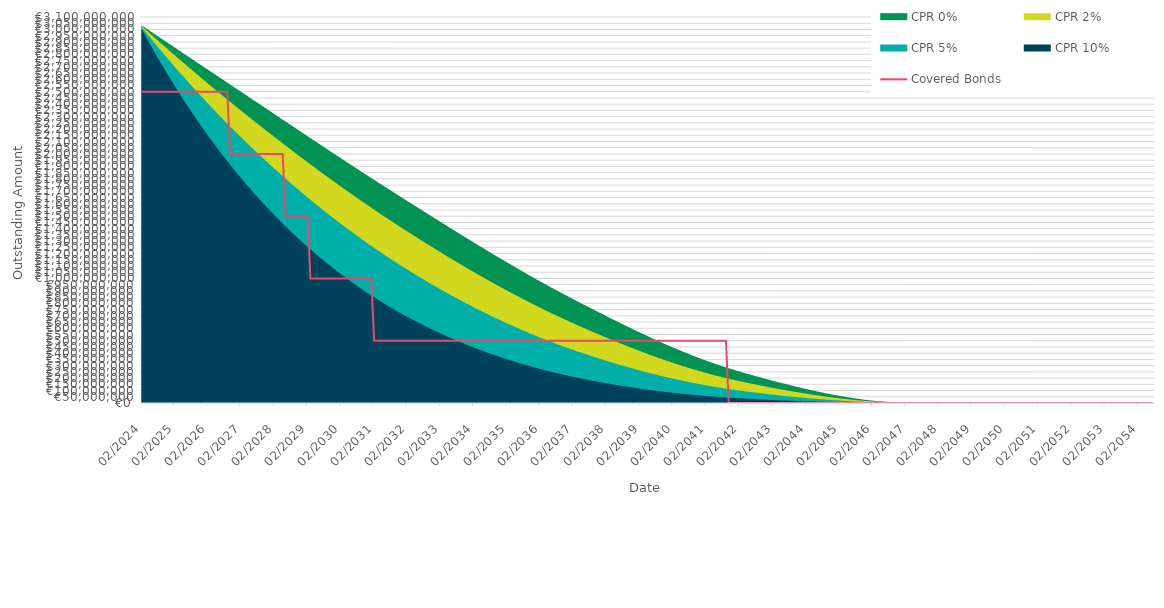
| Category | Covered Bonds |
|---|---|
| 2024-02-29 | 2500000000 |
| 2024-03-31 | 2500000000 |
| 2024-04-30 | 2500000000 |
| 2024-05-31 | 2500000000 |
| 2024-06-30 | 2500000000 |
| 2024-07-31 | 2500000000 |
| 2024-08-31 | 2500000000 |
| 2024-09-30 | 2500000000 |
| 2024-10-31 | 2500000000 |
| 2024-11-30 | 2500000000 |
| 2024-12-31 | 2500000000 |
| 2025-01-31 | 2500000000 |
| 2025-02-28 | 2500000000 |
| 2025-03-31 | 2500000000 |
| 2025-04-30 | 2500000000 |
| 2025-05-31 | 2500000000 |
| 2025-06-30 | 2500000000 |
| 2025-07-31 | 2500000000 |
| 2025-08-31 | 2500000000 |
| 2025-09-30 | 2500000000 |
| 2025-10-31 | 2500000000 |
| 2025-11-30 | 2500000000 |
| 2025-12-31 | 2500000000 |
| 2026-01-31 | 2500000000 |
| 2026-02-28 | 2500000000 |
| 2026-03-31 | 2500000000 |
| 2026-04-30 | 2500000000 |
| 2026-05-31 | 2500000000 |
| 2026-06-30 | 2500000000 |
| 2026-07-31 | 2500000000 |
| 2026-08-31 | 2500000000 |
| 2026-09-30 | 2500000000 |
| 2026-10-31 | 2000000000 |
| 2026-11-30 | 2000000000 |
| 2026-12-31 | 2000000000 |
| 2027-01-31 | 2000000000 |
| 2027-02-28 | 2000000000 |
| 2027-03-31 | 2000000000 |
| 2027-04-30 | 2000000000 |
| 2027-05-31 | 2000000000 |
| 2027-06-30 | 2000000000 |
| 2027-07-31 | 2000000000 |
| 2027-08-31 | 2000000000 |
| 2027-09-30 | 2000000000 |
| 2027-10-31 | 2000000000 |
| 2027-11-30 | 2000000000 |
| 2027-12-31 | 2000000000 |
| 2028-01-31 | 2000000000 |
| 2028-02-29 | 2000000000 |
| 2028-03-31 | 2000000000 |
| 2028-04-30 | 2000000000 |
| 2028-05-31 | 2000000000 |
| 2028-06-30 | 1500000000 |
| 2028-07-31 | 1500000000 |
| 2028-08-31 | 1500000000 |
| 2028-09-30 | 1500000000 |
| 2028-10-31 | 1500000000 |
| 2028-11-30 | 1500000000 |
| 2028-12-31 | 1500000000 |
| 2029-01-31 | 1500000000 |
| 2029-02-28 | 1500000000 |
| 2029-03-31 | 1000000000 |
| 2029-04-30 | 1000000000 |
| 2029-05-31 | 1000000000 |
| 2029-06-30 | 1000000000 |
| 2029-07-31 | 1000000000 |
| 2029-08-31 | 1000000000 |
| 2029-09-30 | 1000000000 |
| 2029-10-31 | 1000000000 |
| 2029-11-30 | 1000000000 |
| 2029-12-31 | 1000000000 |
| 2030-01-31 | 1000000000 |
| 2030-02-28 | 1000000000 |
| 2030-03-31 | 1000000000 |
| 2030-04-30 | 1000000000 |
| 2030-05-31 | 1000000000 |
| 2030-06-30 | 1000000000 |
| 2030-07-31 | 1000000000 |
| 2030-08-31 | 1000000000 |
| 2030-09-30 | 1000000000 |
| 2030-10-31 | 1000000000 |
| 2030-11-30 | 1000000000 |
| 2030-12-31 | 1000000000 |
| 2031-01-31 | 1000000000 |
| 2031-02-28 | 500000000 |
| 2031-03-31 | 500000000 |
| 2031-04-30 | 500000000 |
| 2031-05-31 | 500000000 |
| 2031-06-30 | 500000000 |
| 2031-07-31 | 500000000 |
| 2031-08-31 | 500000000 |
| 2031-09-30 | 500000000 |
| 2031-10-31 | 500000000 |
| 2031-11-30 | 500000000 |
| 2031-12-31 | 500000000 |
| 2032-01-31 | 500000000 |
| 2032-02-29 | 500000000 |
| 2032-03-31 | 500000000 |
| 2032-04-30 | 500000000 |
| 2032-05-31 | 500000000 |
| 2032-06-30 | 500000000 |
| 2032-07-31 | 500000000 |
| 2032-08-31 | 500000000 |
| 2032-09-30 | 500000000 |
| 2032-10-31 | 500000000 |
| 2032-11-30 | 500000000 |
| 2032-12-31 | 500000000 |
| 2033-01-31 | 500000000 |
| 2033-02-28 | 500000000 |
| 2033-03-31 | 500000000 |
| 2033-04-30 | 500000000 |
| 2033-05-31 | 500000000 |
| 2033-06-30 | 500000000 |
| 2033-07-31 | 500000000 |
| 2033-08-31 | 500000000 |
| 2033-09-30 | 500000000 |
| 2033-10-31 | 500000000 |
| 2033-11-30 | 500000000 |
| 2033-12-31 | 500000000 |
| 2034-01-31 | 500000000 |
| 2034-02-28 | 500000000 |
| 2034-03-31 | 500000000 |
| 2034-04-30 | 500000000 |
| 2034-05-31 | 500000000 |
| 2034-06-30 | 500000000 |
| 2034-07-31 | 500000000 |
| 2034-08-31 | 500000000 |
| 2034-09-30 | 500000000 |
| 2034-10-31 | 500000000 |
| 2034-11-30 | 500000000 |
| 2034-12-31 | 500000000 |
| 2035-01-31 | 500000000 |
| 2035-02-28 | 500000000 |
| 2035-03-31 | 500000000 |
| 2035-04-30 | 500000000 |
| 2035-05-31 | 500000000 |
| 2035-06-30 | 500000000 |
| 2035-07-31 | 500000000 |
| 2035-08-31 | 500000000 |
| 2035-09-30 | 500000000 |
| 2035-10-31 | 500000000 |
| 2035-11-30 | 500000000 |
| 2035-12-31 | 500000000 |
| 2036-01-31 | 500000000 |
| 2036-02-29 | 500000000 |
| 2036-03-31 | 500000000 |
| 2036-04-30 | 500000000 |
| 2036-05-31 | 500000000 |
| 2036-06-30 | 500000000 |
| 2036-07-31 | 500000000 |
| 2036-08-31 | 500000000 |
| 2036-09-30 | 500000000 |
| 2036-10-31 | 500000000 |
| 2036-11-30 | 500000000 |
| 2036-12-31 | 500000000 |
| 2037-01-31 | 500000000 |
| 2037-02-28 | 500000000 |
| 2037-03-31 | 500000000 |
| 2037-04-30 | 500000000 |
| 2037-05-31 | 500000000 |
| 2037-06-30 | 500000000 |
| 2037-07-31 | 500000000 |
| 2037-08-31 | 500000000 |
| 2037-09-30 | 500000000 |
| 2037-10-31 | 500000000 |
| 2037-11-30 | 500000000 |
| 2037-12-31 | 500000000 |
| 2038-01-31 | 500000000 |
| 2038-02-28 | 500000000 |
| 2038-03-31 | 500000000 |
| 2038-04-30 | 500000000 |
| 2038-05-31 | 500000000 |
| 2038-06-30 | 500000000 |
| 2038-07-31 | 500000000 |
| 2038-08-31 | 500000000 |
| 2038-09-30 | 500000000 |
| 2038-10-31 | 500000000 |
| 2038-11-30 | 500000000 |
| 2038-12-31 | 500000000 |
| 2039-01-31 | 500000000 |
| 2039-02-28 | 500000000 |
| 2039-03-31 | 500000000 |
| 2039-04-30 | 500000000 |
| 2039-05-31 | 500000000 |
| 2039-06-30 | 500000000 |
| 2039-07-31 | 500000000 |
| 2039-08-31 | 500000000 |
| 2039-09-30 | 500000000 |
| 2039-10-31 | 500000000 |
| 2039-11-30 | 500000000 |
| 2039-12-31 | 500000000 |
| 2040-01-31 | 500000000 |
| 2040-02-29 | 500000000 |
| 2040-03-31 | 500000000 |
| 2040-04-30 | 500000000 |
| 2040-05-31 | 500000000 |
| 2040-06-30 | 500000000 |
| 2040-07-31 | 500000000 |
| 2040-08-31 | 500000000 |
| 2040-09-30 | 500000000 |
| 2040-10-31 | 500000000 |
| 2040-11-30 | 500000000 |
| 2040-12-31 | 500000000 |
| 2041-01-31 | 500000000 |
| 2041-02-28 | 500000000 |
| 2041-03-31 | 500000000 |
| 2041-04-30 | 500000000 |
| 2041-05-31 | 500000000 |
| 2041-06-30 | 500000000 |
| 2041-07-31 | 500000000 |
| 2041-08-31 | 500000000 |
| 2041-09-30 | 500000000 |
| 2041-10-31 | 0 |
| 2041-11-30 | 0 |
| 2041-12-31 | 0 |
| 2042-01-31 | 0 |
| 2042-02-28 | 0 |
| 2042-03-31 | 0 |
| 2042-04-30 | 0 |
| 2042-05-31 | 0 |
| 2042-06-30 | 0 |
| 2042-07-31 | 0 |
| 2042-08-31 | 0 |
| 2042-09-30 | 0 |
| 2042-10-31 | 0 |
| 2042-11-30 | 0 |
| 2042-12-31 | 0 |
| 2043-01-31 | 0 |
| 2043-02-28 | 0 |
| 2043-03-31 | 0 |
| 2043-04-30 | 0 |
| 2043-05-31 | 0 |
| 2043-06-30 | 0 |
| 2043-07-31 | 0 |
| 2043-08-31 | 0 |
| 2043-09-30 | 0 |
| 2043-10-31 | 0 |
| 2043-11-30 | 0 |
| 2043-12-31 | 0 |
| 2044-01-31 | 0 |
| 2044-02-29 | 0 |
| 2044-03-31 | 0 |
| 2044-04-30 | 0 |
| 2044-05-31 | 0 |
| 2044-06-30 | 0 |
| 2044-07-31 | 0 |
| 2044-08-31 | 0 |
| 2044-09-30 | 0 |
| 2044-10-31 | 0 |
| 2044-11-30 | 0 |
| 2044-12-31 | 0 |
| 2045-01-31 | 0 |
| 2045-02-28 | 0 |
| 2045-03-31 | 0 |
| 2045-04-30 | 0 |
| 2045-05-31 | 0 |
| 2045-06-30 | 0 |
| 2045-07-31 | 0 |
| 2045-08-31 | 0 |
| 2045-09-30 | 0 |
| 2045-10-31 | 0 |
| 2045-11-30 | 0 |
| 2045-12-31 | 0 |
| 2046-01-31 | 0 |
| 2046-02-28 | 0 |
| 2046-03-31 | 0 |
| 2046-04-30 | 0 |
| 2046-05-31 | 0 |
| 2046-06-30 | 0 |
| 2046-07-31 | 0 |
| 2046-08-31 | 0 |
| 2046-09-30 | 0 |
| 2046-10-31 | 0 |
| 2046-11-30 | 0 |
| 2046-12-31 | 0 |
| 2047-01-31 | 0 |
| 2047-02-28 | 0 |
| 2047-03-31 | 0 |
| 2047-04-30 | 0 |
| 2047-05-31 | 0 |
| 2047-06-30 | 0 |
| 2047-07-31 | 0 |
| 2047-08-31 | 0 |
| 2047-09-30 | 0 |
| 2047-10-31 | 0 |
| 2047-11-30 | 0 |
| 2047-12-31 | 0 |
| 2048-01-31 | 0 |
| 2048-02-29 | 0 |
| 2048-03-31 | 0 |
| 2048-04-30 | 0 |
| 2048-05-31 | 0 |
| 2048-06-30 | 0 |
| 2048-07-31 | 0 |
| 2048-08-31 | 0 |
| 2048-09-30 | 0 |
| 2048-10-31 | 0 |
| 2048-11-30 | 0 |
| 2048-12-31 | 0 |
| 2049-01-31 | 0 |
| 2049-02-28 | 0 |
| 2049-03-31 | 0 |
| 2049-04-30 | 0 |
| 2049-05-31 | 0 |
| 2049-06-30 | 0 |
| 2049-07-31 | 0 |
| 2049-08-31 | 0 |
| 2049-09-30 | 0 |
| 2049-10-31 | 0 |
| 2049-11-30 | 0 |
| 2049-12-31 | 0 |
| 2050-01-31 | 0 |
| 2050-02-28 | 0 |
| 2050-03-31 | 0 |
| 2050-04-30 | 0 |
| 2050-05-31 | 0 |
| 2050-06-30 | 0 |
| 2050-07-31 | 0 |
| 2050-08-31 | 0 |
| 2050-09-30 | 0 |
| 2050-10-31 | 0 |
| 2050-11-30 | 0 |
| 2050-12-31 | 0 |
| 2051-01-31 | 0 |
| 2051-02-28 | 0 |
| 2051-03-31 | 0 |
| 2051-04-30 | 0 |
| 2051-05-31 | 0 |
| 2051-06-30 | 0 |
| 2051-07-31 | 0 |
| 2051-08-31 | 0 |
| 2051-09-30 | 0 |
| 2051-10-31 | 0 |
| 2051-11-30 | 0 |
| 2051-12-31 | 0 |
| 2052-01-31 | 0 |
| 2052-02-29 | 0 |
| 2052-03-31 | 0 |
| 2052-04-30 | 0 |
| 2052-05-31 | 0 |
| 2052-06-30 | 0 |
| 2052-07-31 | 0 |
| 2052-08-31 | 0 |
| 2052-09-30 | 0 |
| 2052-10-31 | 0 |
| 2052-11-30 | 0 |
| 2052-12-31 | 0 |
| 2053-01-31 | 0 |
| 2053-02-28 | 0 |
| 2053-03-31 | 0 |
| 2053-04-30 | 0 |
| 2053-05-31 | 0 |
| 2053-06-30 | 0 |
| 2053-07-31 | 0 |
| 2053-08-31 | 0 |
| 2053-09-30 | 0 |
| 2053-10-31 | 0 |
| 2053-11-30 | 0 |
| 2053-12-31 | 0 |
| 2054-01-31 | 0 |
| 2054-02-28 | 0 |
| 2054-03-31 | 0 |
| 2054-04-30 | 0 |
| 2054-05-31 | 0 |
| 2054-06-30 | 0 |
| 2054-07-31 | 0 |